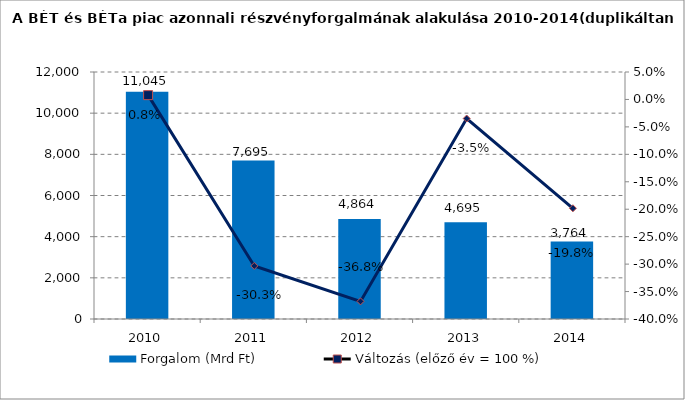
| Category | Forgalom (Mrd Ft) |
|---|---|
| 2010.0 | 11045 |
| 2011.0 | 7695 |
| 2012.0 | 4864 |
| 2013.0 | 4695 |
| 2014.0 | 3764 |